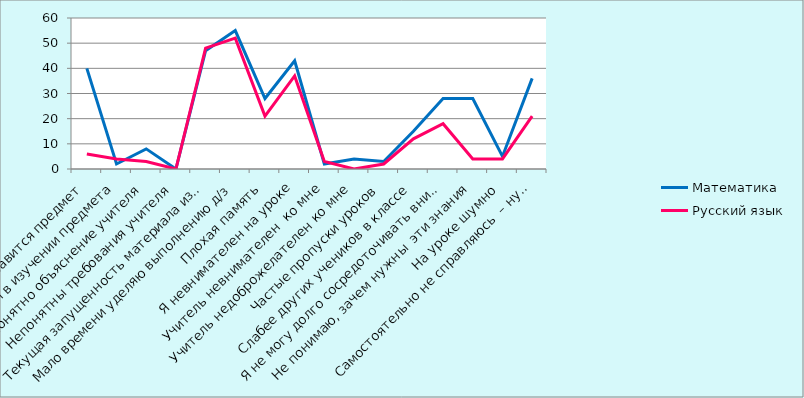
| Category | Математика | Русский язык |
|---|---|---|
| Не нравится предмет | 40 | 6 |
| Нет потребности в изучении предмета | 2 | 4 |
| Непонятно объяснение учителя | 8 | 3 |
| Непонятны требования учителя | 0 | 0 |
| Текущая запущенность материала из-за лени | 47 | 48 |
| Мало времени уделяю выполнению д/з | 55 | 52 |
| Плохая память | 28 | 21 |
| Я невнимателен на уроке | 43 | 37 |
| Учитель невнимателен  ко мне | 2 | 3 |
| Учитель недоброжелателен ко мне | 4 | 0 |
| Частые пропуски уроков | 3 | 2 |
| Слабее других учеников в классе | 15 | 12 |
| Я не могу долго сосредоточивать внимание | 28 | 18 |
| Не понимаю, зачем нужны  эти знания | 28 | 4 |
| На уроке шумно | 5 | 4 |
| Самостоятельно не справляюсь  – нужна помощь  | 36 | 21 |